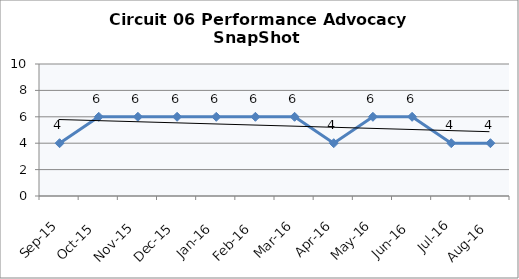
| Category | Circuit 06 |
|---|---|
| Sep-15 | 4 |
| Oct-15 | 6 |
| Nov-15 | 6 |
| Dec-15 | 6 |
| Jan-16 | 6 |
| Feb-16 | 6 |
| Mar-16 | 6 |
| Apr-16 | 4 |
| May-16 | 6 |
| Jun-16 | 6 |
| Jul-16 | 4 |
| Aug-16 | 4 |